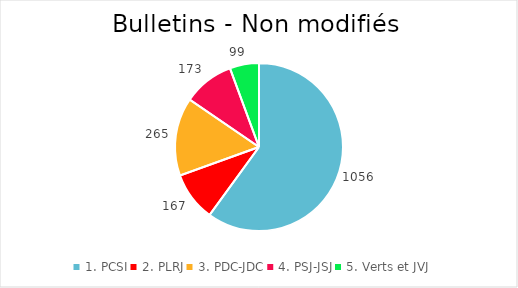
| Category | Series 0 |
|---|---|
| 1. PCSI | 1056 |
| 2. PLRJ | 167 |
| 3. PDC-JDC | 265 |
| 4. PSJ-JSJ | 173 |
| 5. Verts et JVJ | 99 |